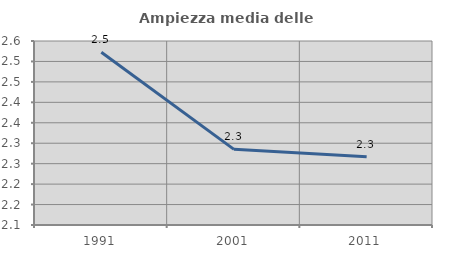
| Category | Ampiezza media delle famiglie |
|---|---|
| 1991.0 | 2.522 |
| 2001.0 | 2.285 |
| 2011.0 | 2.267 |